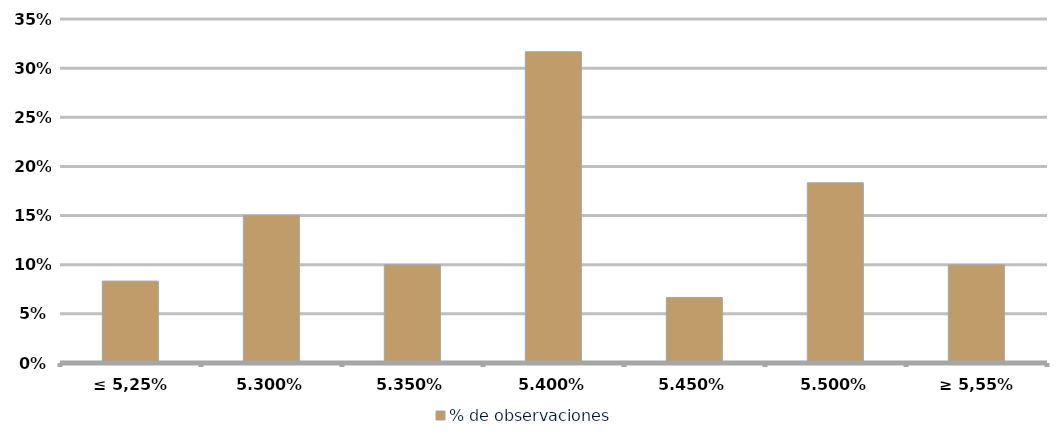
| Category | % de observaciones  |
|---|---|
| ≤ 5,25% | 0.083 |
| 5.30% | 0.15 |
| 5.35% | 0.1 |
| 5.40% | 0.317 |
| 5.45% | 0.067 |
| 5.50% | 0.183 |
| ≥ 5,55% | 0.1 |